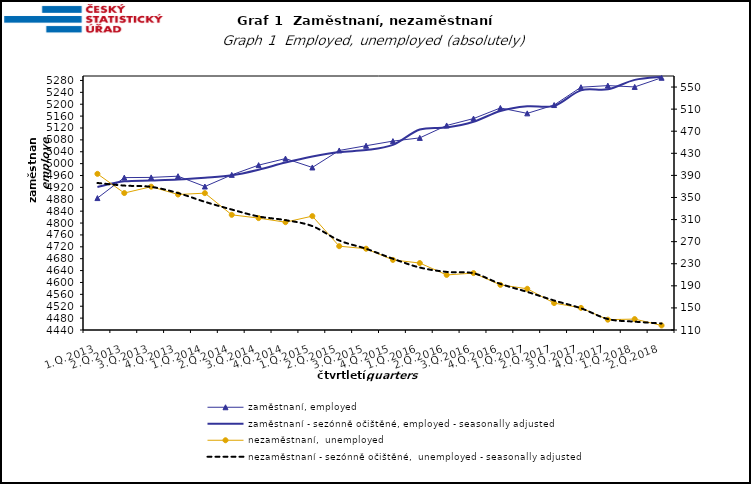
| Category | zaměstnaní, employed | zaměstnaní - sezónně očištěné, employed - seasonally adjusted |
|---|---|---|
| 1.Q.2013 | 4884.025 | 4921.298 |
| 2.Q.2013 | 4952.991 | 4940.38 |
| 3.Q.2013 | 4953.606 | 4943.118 |
| 4.Q.2013 | 4957.713 | 4946.225 |
| 1.Q.2014 | 4922.963 | 4952.405 |
| 2.Q.2014 | 4962.219 | 4960.65 |
| 3.Q.2014 | 4994.947 | 4979.618 |
| 4.Q.2014 | 5017.051 | 5003.629 |
| 1.Q.2015 | 4987.141 | 5023.827 |
| 2.Q.2015 | 5044.285 | 5038.984 |
| 3.Q.2015 | 5060.3 | 5045.647 |
| 4.Q.2015 | 5075.884 | 5063.085 |
| 1.Q.2016 | 5086.671 | 5114.698 |
| 2.Q.2016 | 5128.493 | 5121.602 |
| 3.Q.2016 | 5151.712 | 5140.967 |
| 4.Q.2016 | 5187.436 | 5177.35 |
| 1.Q.2017 | 5169.203 | 5192.941 |
| 2.Q.2017 | 5197.265 | 5194.555 |
| 3.Q.2017 | 5257.26 | 5246.726 |
| 4.Q.2017 | 5262.691 | 5250.237 |
| 1.Q.2018 | 5258.225 | 5281.99 |
| 2.Q.2018 | 5289.066 | 5292.172 |